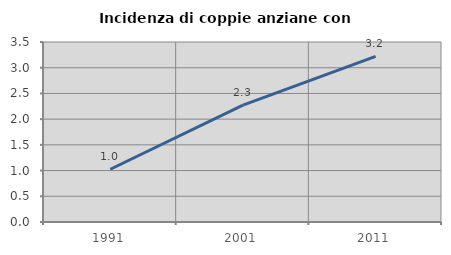
| Category | Incidenza di coppie anziane con figli |
|---|---|
| 1991.0 | 1.026 |
| 2001.0 | 2.271 |
| 2011.0 | 3.219 |